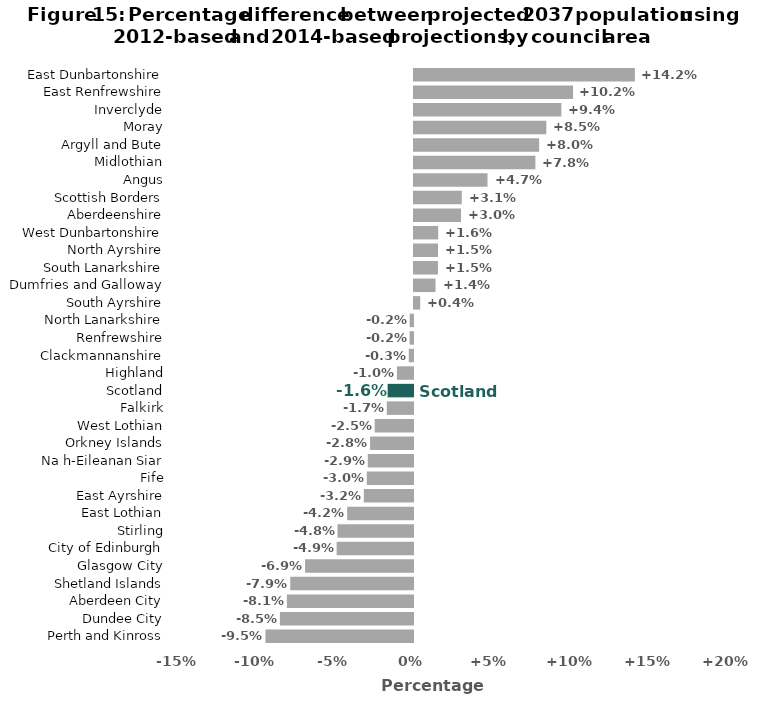
| Category | Series 0 |
|---|---|
| Perth and Kinross | -9.457 |
| Dundee City | -8.532 |
| Aberdeen City | -8.084 |
| Shetland Islands | -7.87 |
| Glasgow City | -6.92 |
| City of Edinburgh | -4.895 |
| Stirling | -4.839 |
| East Lothian | -4.221 |
| East Ayrshire | -3.153 |
| Fife | -2.965 |
| Na h-Eileanan Siar | -2.899 |
| Orkney Islands | -2.75 |
| West Lothian | -2.455 |
| Falkirk | -1.68 |
| Scotland | -1.628 |
| Highland | -1.03 |
| Clackmannanshire | -0.272 |
| Renfrewshire | -0.218 |
| North Lanarkshire | -0.215 |
| South Ayrshire | 0.396 |
| Dumfries and Galloway | 1.378 |
| South Lanarkshire | 1.535 |
| North Ayrshire | 1.54 |
| West Dunbartonshire | 1.551 |
| Aberdeenshire | 3.013 |
| Scottish Borders | 3.064 |
| Angus | 4.712 |
| Midlothian | 7.783 |
| Argyll and Bute | 8.023 |
| Moray | 8.483 |
| Inverclyde | 9.446 |
| East Renfrewshire | 10.193 |
| East Dunbartonshire | 14.161 |